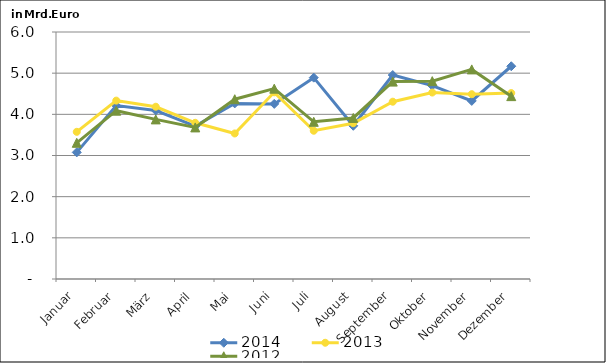
| Category | 2014 | 2013 | 2012 |
|---|---|---|---|
| Januar | 3.076 | 3.575 | 3.308 |
| Februar | 4.212 | 4.333 | 4.089 |
| März | 4.093 | 4.184 | 3.877 |
| April | 3.715 | 3.794 | 3.682 |
| Mai | 4.266 | 3.535 | 4.367 |
| Juni | 4.254 | 4.535 | 4.624 |
| Juli | 4.891 | 3.602 | 3.819 |
| August | 3.722 | 3.784 | 3.912 |
| September | 4.955 | 4.307 | 4.795 |
| Oktober | 4.698 | 4.529 | 4.807 |
| November | 4.326 | 4.489 | 5.092 |
| Dezember | 5.168 | 4.516 | 4.442 |